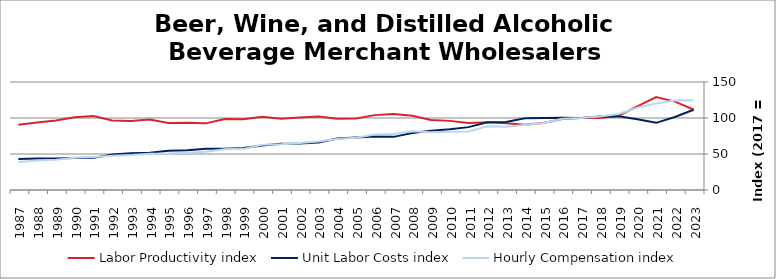
| Category | Labor Productivity index | Unit Labor Costs index | Hourly Compensation index |
|---|---|---|---|
| 2023.0 | 111.756 | 111.494 | 124.601 |
| 2022.0 | 122.759 | 101.377 | 124.449 |
| 2021.0 | 128.961 | 93.275 | 120.289 |
| 2020.0 | 116.261 | 98.17 | 114.133 |
| 2019.0 | 103.139 | 102.382 | 105.596 |
| 2018.0 | 100.125 | 101.974 | 102.101 |
| 2017.0 | 100 | 100 | 100 |
| 2016.0 | 98.571 | 100.322 | 98.888 |
| 2015.0 | 93.072 | 100.036 | 93.105 |
| 2014.0 | 90.495 | 99.64 | 90.169 |
| 2013.0 | 92.776 | 94.55 | 87.72 |
| 2012.0 | 93.97 | 94.055 | 88.383 |
| 2011.0 | 93.214 | 87.331 | 81.405 |
| 2010.0 | 96.007 | 84.266 | 80.901 |
| 2009.0 | 97.25 | 82.314 | 80.05 |
| 2008.0 | 103.102 | 79.073 | 81.526 |
| 2007.0 | 105.494 | 73.794 | 77.848 |
| 2006.0 | 103.995 | 74.248 | 77.214 |
| 2005.0 | 99.321 | 72.949 | 72.454 |
| 2004.0 | 99.128 | 71.409 | 70.786 |
| 2003.0 | 102.009 | 66.081 | 67.409 |
| 2002.0 | 100.758 | 64.753 | 65.244 |
| 2001.0 | 99.077 | 64.098 | 63.507 |
| 2000.0 | 101.679 | 61.736 | 62.772 |
| 1999.0 | 98.105 | 58.233 | 57.13 |
| 1998.0 | 98.719 | 57.422 | 56.686 |
| 1997.0 | 92.553 | 57.371 | 53.099 |
| 1996.0 | 93.313 | 55.36 | 51.658 |
| 1995.0 | 93.047 | 54.495 | 50.706 |
| 1994.0 | 97.822 | 51.637 | 50.513 |
| 1993.0 | 95.666 | 50.918 | 48.712 |
| 1992.0 | 96.559 | 49.226 | 47.532 |
| 1991.0 | 102.62 | 44.628 | 45.797 |
| 1990.0 | 100.951 | 44.354 | 44.776 |
| 1989.0 | 96.38 | 43.744 | 42.16 |
| 1988.0 | 93.709 | 43.857 | 41.097 |
| 1987.0 | 90.648 | 43.085 | 39.055 |